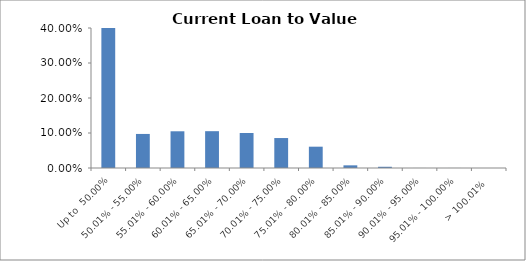
| Category | Series 0 |
|---|---|
| Up to  50.00% | 0.435 |
| 50.01% - 55.00% | 0.097 |
| 55.01% - 60.00% | 0.105 |
| 60.01% - 65.00% | 0.105 |
| 65.01% - 70.00% | 0.1 |
| 70.01% - 75.00% | 0.086 |
| 75.01% - 80.00% | 0.061 |
| 80.01% - 85.00% | 0.008 |
| 85.01% - 90.00% | 0.004 |
| 90.01% - 95.00% | 0 |
| 95.01% - 100.00% | 0 |
| > 100.01% | 0 |